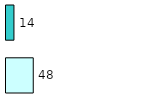
| Category | Series 0 | Series 1 |
|---|---|---|
| 0 | 48 | 14 |